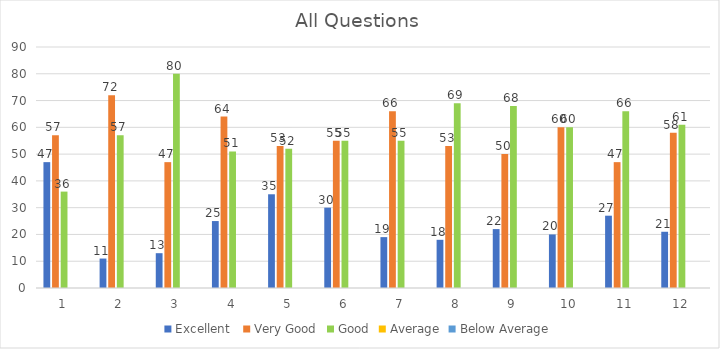
| Category | Excellent  | Very Good | Good | Average | Below Average |
|---|---|---|---|---|---|
| 0 | 47 | 57 | 36 | 0 | 0 |
| 1 | 11 | 72 | 57 | 0 | 0 |
| 2 | 13 | 47 | 80 | 0 | 0 |
| 3 | 25 | 64 | 51 | 0 | 0 |
| 4 | 35 | 53 | 52 | 0 | 0 |
| 5 | 30 | 55 | 55 | 0 | 0 |
| 6 | 19 | 66 | 55 | 0 | 0 |
| 7 | 18 | 53 | 69 | 0 | 0 |
| 8 | 22 | 50 | 68 | 0 | 0 |
| 9 | 20 | 60 | 60 | 0 | 0 |
| 10 | 27 | 47 | 66 | 0 | 0 |
| 11 | 21 | 58 | 61 | 0 | 0 |